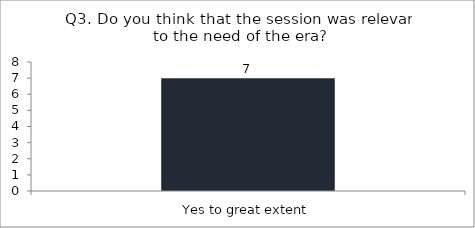
| Category | Q3. Do you think that the session was relevant to the need of the era? |
|---|---|
| Yes to great extent | 7 |